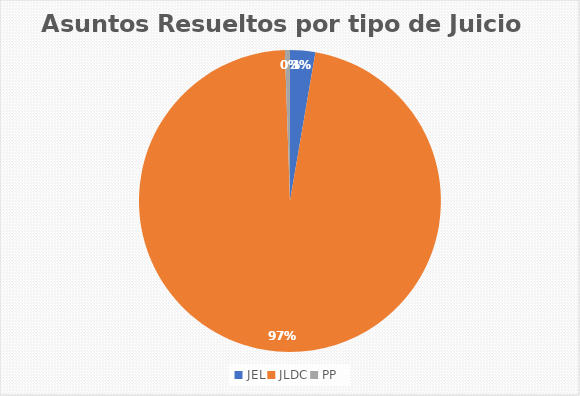
| Category | Rubro Cantidad |
|---|---|
| JEL | 15 |
| JLDC | 538 |
| PP | 3 |